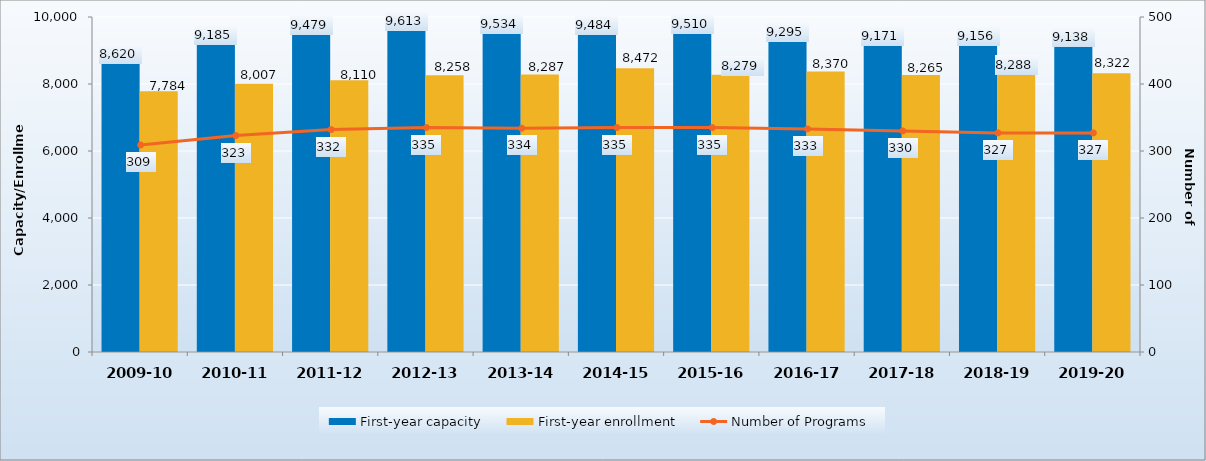
| Category | First-year capacity | First-year enrollment |
|---|---|---|
| 2009-10 | 8620 | 7784 |
| 2010-11 | 9185 | 8007 |
| 2011-12 | 9479 | 8110 |
| 2012-13 | 9613 | 8258 |
| 2013-14 | 9534 | 8287 |
| 2014-15 | 9484 | 8472 |
| 2015-16 | 9510 | 8279 |
| 2016-17 | 9295 | 8370 |
| 2017-18 | 9171 | 8265 |
| 2018-19 | 9156 | 8288 |
| 2019-20 | 9138 | 8322 |